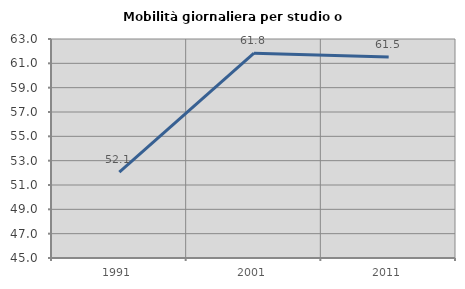
| Category | Mobilità giornaliera per studio o lavoro |
|---|---|
| 1991.0 | 52.067 |
| 2001.0 | 61.833 |
| 2011.0 | 61.519 |